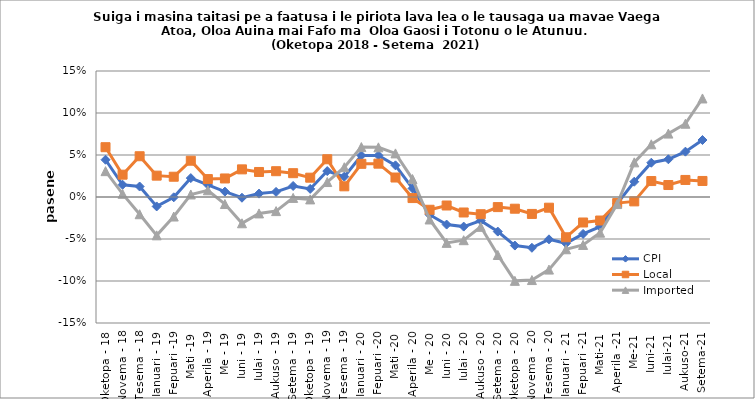
| Category | CPI | Local | Imported |
|---|---|---|---|
| Oketopa - 18 | 0.044 | 0.059 | 0.031 |
| Novema - 18 | 0.015 | 0.027 | 0.004 |
| Tesema - 18 | 0.012 | 0.049 | -0.021 |
| Ianuari - 19 | -0.011 | 0.025 | -0.046 |
| Fepuari -19 | 0 | 0.024 | -0.023 |
| Mati -19 | 0.023 | 0.043 | 0.003 |
| Aperila - 19 | 0.015 | 0.021 | 0.008 |
| Me - 19 | 0.006 | 0.022 | -0.008 |
| Iuni - 19 | -0.001 | 0.033 | -0.031 |
| Iulai - 19 | 0.004 | 0.03 | -0.02 |
| Aukuso - 19 | 0.006 | 0.031 | -0.017 |
| Setema - 19 | 0.013 | 0.028 | -0.001 |
| Oketopa - 19 | 0.01 | 0.023 | -0.003 |
| Novema - 19 | 0.031 | 0.045 | 0.018 |
| Tesema - 19 | 0.024 | 0.013 | 0.035 |
| Ianuari - 20 | 0.049 | 0.039 | 0.059 |
| Fepuari -20 | 0.05 | 0.04 | 0.059 |
| Mati -20 | 0.038 | 0.023 | 0.052 |
| Aperila - 20 | 0.01 | -0.001 | 0.021 |
| Me - 20 | -0.021 | -0.015 | -0.027 |
| Iuni - 20 | -0.033 | -0.01 | -0.055 |
| Iulai - 20 | -0.035 | -0.018 | -0.051 |
| Aukuso - 20 | -0.028 | -0.02 | -0.036 |
| Setema - 20 | -0.041 | -0.012 | -0.069 |
| Oketopa - 20 | -0.058 | -0.014 | -0.1 |
| Novema - 20 | -0.06 | -0.02 | -0.099 |
| Tesema - 20 | -0.05 | -0.013 | -0.086 |
| Ianuari - 21 | -0.055 | -0.048 | -0.062 |
| Fepuari -21 | -0.044 | -0.03 | -0.057 |
| Mati-21 | -0.035 | -0.028 | -0.043 |
| Aperila -21 | -0.008 | -0.007 | -0.008 |
| Me-21 | 0.018 | -0.005 | 0.041 |
| Iuni-21 | 0.041 | 0.019 | 0.063 |
| Iulai-21 | 0.045 | 0.014 | 0.075 |
| Aukuso-21 | 0.054 | 0.02 | 0.087 |
| Setema-21 | 0.068 | 0.019 | 0.117 |